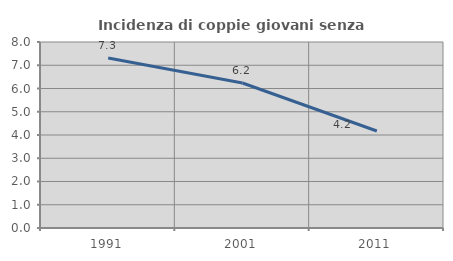
| Category | Incidenza di coppie giovani senza figli |
|---|---|
| 1991.0 | 7.308 |
| 2001.0 | 6.236 |
| 2011.0 | 4.172 |